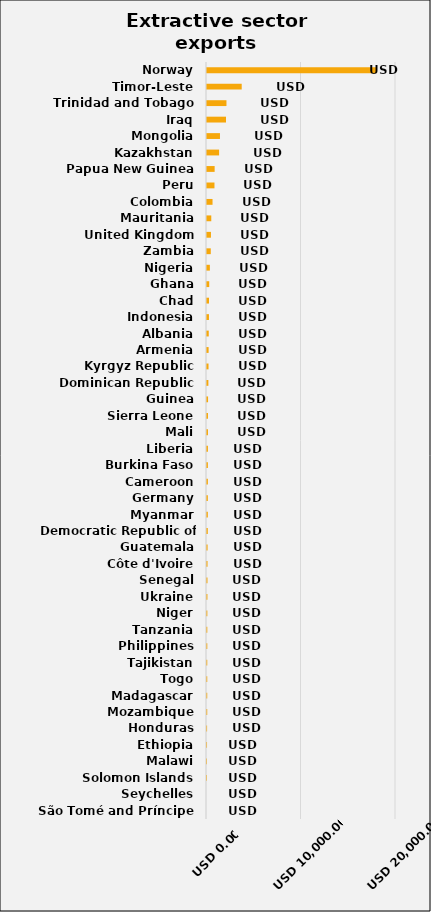
| Category | Total |
|---|---|
| São Tomé and Príncipe | 0 |
| Seychelles | 0 |
| Solomon Islands | 0.004 |
| Malawi | 0.406 |
| Ethiopia | 3.697 |
| Honduras | 10.276 |
| Mozambique | 25.76 |
| Madagascar | 27.197 |
| Togo | 28.14 |
| Tajikistan | 29.071 |
| Philippines | 32.886 |
| Tanzania | 34.133 |
| Niger | 37.359 |
| Ukraine | 46.364 |
| Senegal | 51.64 |
| Côte d'Ivoire | 56.944 |
| Guatemala | 63.51 |
| Democratic Republic of Congo | 83.571 |
| Myanmar | 88.554 |
| Germany | 89.052 |
| Cameroon | 92.656 |
| Burkina Faso | 94.223 |
| Liberia | 97.986 |
| Mali | 101.73 |
| Sierra Leone | 104.153 |
| Guinea | 112.734 |
| Dominican Republic | 145.947 |
| Kyrgyz Republic | 160.872 |
| Armenia | 169.858 |
| Albania | 184.038 |
| Indonesia | 207.473 |
| Chad | 212.576 |
| Ghana | 237.104 |
| Nigeria | 302.842 |
| Zambia | 398.807 |
| United Kingdom | 417.877 |
| Mauritania | 452.812 |
| Colombia | 585.824 |
| Peru | 790.207 |
| Papua New Guinea | 808.616 |
| Kazakhstan | 1280.946 |
| Mongolia | 1372.251 |
| Iraq | 2011.609 |
| Trinidad and Tobago | 2059.956 |
| Timor-Leste | 3673.376 |
| Norway | 17927.565 |